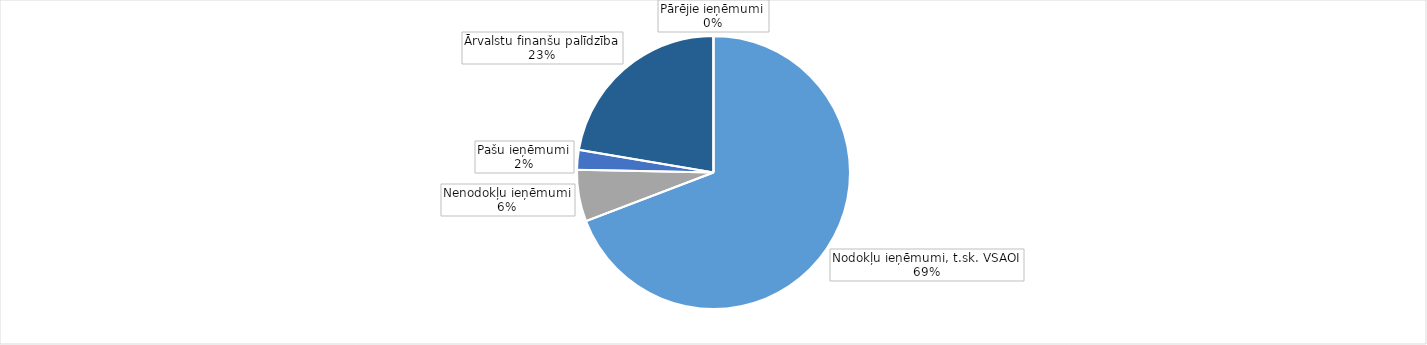
| Category | Series 0 |
|---|---|
| Nodokļu ieņēmumi, t.sk. VSAOI | 1184611.626 |
| Nenodokļu ieņēmumi | 104818.484 |
| Pašu ieņēmumi | 39882.816 |
| Ārvalstu finanšu palīdzība | 382352.757 |
| Pārējie ieņēmumi | 194.562 |